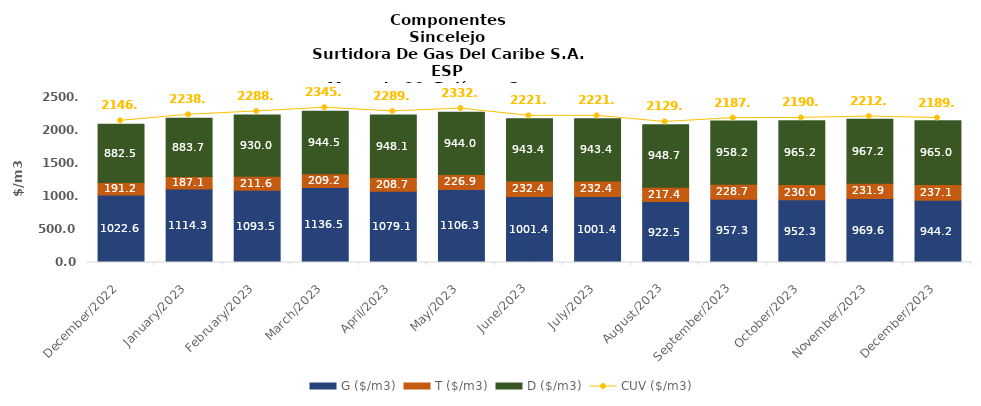
| Category | G ($/m3) | T ($/m3) | D ($/m3) |
|---|---|---|---|
| 2022-12-01 | 1022.62 | 191.17 | 882.47 |
| 2023-01-01 | 1114.3 | 187.05 | 883.66 |
| 2023-02-01 | 1093.5 | 211.55 | 930.03 |
| 2023-03-01 | 1136.5 | 209.16 | 944.52 |
| 2023-04-01 | 1079.14 | 208.7 | 948.13 |
| 2023-05-01 | 1106.33 | 226.94 | 944.03 |
| 2023-06-01 | 1001.4 | 232.37 | 943.37 |
| 2023-07-01 | 1001.4 | 232.37 | 943.37 |
| 2023-08-01 | 922.47 | 217.36 | 948.72 |
| 2023-09-01 | 957.29 | 228.69 | 958.18 |
| 2023-10-01 | 952.33 | 230.03 | 965.19 |
| 2023-11-01 | 969.64 | 231.88 | 967.17 |
| 2023-12-01 | 944.16 | 237.1 | 964.97 |